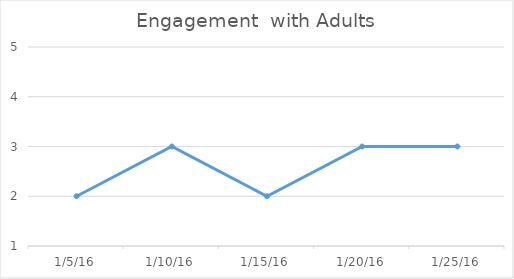
| Category | Series 0 |
|---|---|
| 1/5/16 | 2 |
| 1/10/16 | 3 |
| 1/15/16 | 2 |
| 1/20/16 | 3 |
| 1/25/16 | 3 |